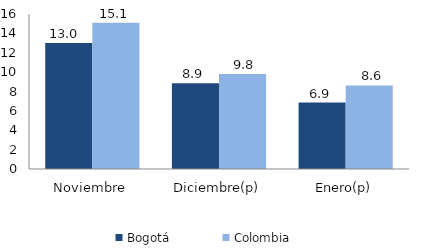
| Category | Bogotá | Colombia |
|---|---|---|
| Noviembre | 13.015 | 15.086 |
| Diciembre(p) | 8.862 | 9.8 |
| Enero(p) | 6.863 | 8.631 |